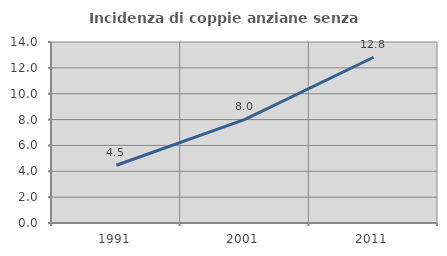
| Category | Incidenza di coppie anziane senza figli  |
|---|---|
| 1991.0 | 4.467 |
| 2001.0 | 8.022 |
| 2011.0 | 12.821 |